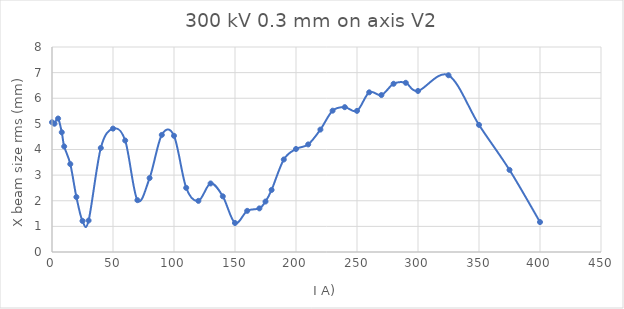
| Category | Series 0 |
|---|---|
| 0.0 | 5.064 |
| 2.0 | 5.005 |
| 5.0 | 5.209 |
| 8.0 | 4.672 |
| 10.0 | 4.119 |
| 15.0 | 3.431 |
| 20.0 | 2.145 |
| 25.0 | 1.212 |
| 30.0 | 1.228 |
| 40.0 | 4.059 |
| 50.0 | 4.815 |
| 60.0 | 4.35 |
| 70.0 | 2.022 |
| 80.0 | 2.886 |
| 90.0 | 4.569 |
| 100.0 | 4.534 |
| 110.0 | 2.503 |
| 120.0 | 1.996 |
| 130.0 | 2.675 |
| 140.0 | 2.173 |
| 150.0 | 1.132 |
| 160.0 | 1.606 |
| 170.0 | 1.702 |
| 175.0 | 1.97 |
| 180.0 | 2.422 |
| 190.0 | 3.61 |
| 200.0 | 4.02 |
| 210.0 | 4.198 |
| 220.0 | 4.778 |
| 230.0 | 5.515 |
| 240.0 | 5.652 |
| 250.0 | 5.507 |
| 260.0 | 6.231 |
| 270.0 | 6.125 |
| 280.0 | 6.565 |
| 290.0 | 6.603 |
| 300.0 | 6.284 |
| 325.0 | 6.897 |
| 350.0 | 4.96 |
| 375.0 | 3.203 |
| 400.0 | 1.168 |